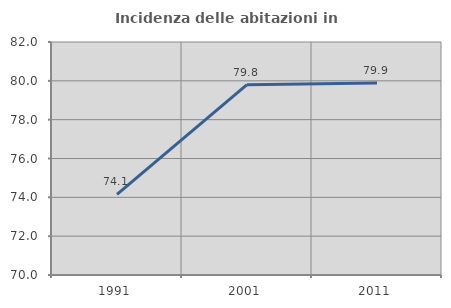
| Category | Incidenza delle abitazioni in proprietà  |
|---|---|
| 1991.0 | 74.147 |
| 2001.0 | 79.805 |
| 2011.0 | 79.884 |